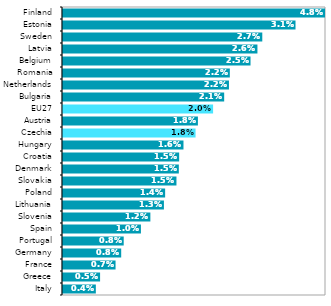
| Category | 2019* |
|---|---|
| Italy | 0.004 |
| Greece | 0.005 |
| France | 0.007 |
| Germany | 0.008 |
| Portugal | 0.008 |
| Spain | 0.01 |
| Slovenia | 0.012 |
| Lithuania | 0.013 |
| Poland | 0.014 |
| Slovakia | 0.015 |
| Denmark | 0.015 |
| Croatia | 0.015 |
| Hungary | 0.016 |
| Czechia | 0.018 |
| Austria | 0.018 |
| EU27 | 0.02 |
| Bulgaria | 0.021 |
| Netherlands | 0.022 |
| Romania | 0.022 |
| Belgium | 0.025 |
| Latvia | 0.026 |
| Sweden | 0.027 |
| Estonia | 0.031 |
| Finland | 0.048 |